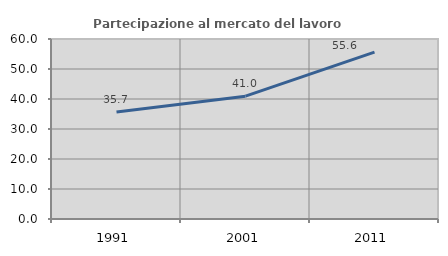
| Category | Partecipazione al mercato del lavoro  femminile |
|---|---|
| 1991.0 | 35.656 |
| 2001.0 | 40.952 |
| 2011.0 | 55.611 |